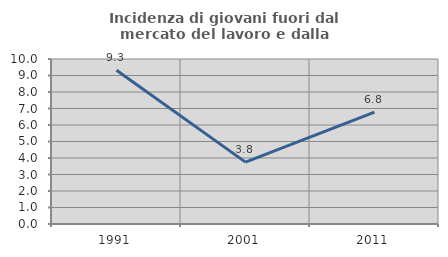
| Category | Incidenza di giovani fuori dal mercato del lavoro e dalla formazione  |
|---|---|
| 1991.0 | 9.324 |
| 2001.0 | 3.75 |
| 2011.0 | 6.776 |